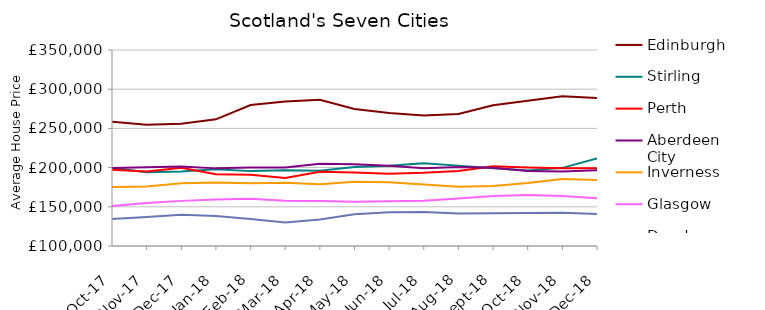
| Category | Edinburgh | Stirling | Perth | Aberdeen City | Inverness | Glasgow | Dundee |
|---|---|---|---|---|---|---|---|
| 2017-10-01 | 258624.658 | 199977.504 | 197366.042 | 199561.968 | 175219.552 | 150908.758 | 134506.967 |
| 2017-11-01 | 254723.349 | 193985.398 | 194982.195 | 200597.133 | 175912.734 | 154872.399 | 137051.835 |
| 2017-12-01 | 255812.34 | 194988.704 | 199764.477 | 201542.313 | 180030.372 | 157559.078 | 139823.634 |
| 2018-01-01 | 261527.705 | 197955.472 | 191472.703 | 199013.46 | 181027.908 | 159423.582 | 138331.855 |
| 2018-02-01 | 279795.792 | 195505.691 | 190803.982 | 200135.032 | 179984.645 | 160263.332 | 134403.409 |
| 2018-03-01 | 284301.797 | 196655.662 | 186883.475 | 200264.938 | 180783.251 | 157781.382 | 129941.658 |
| 2018-04-01 | 286435.635 | 196058.642 | 194690.449 | 204855.489 | 178649.291 | 157532.91 | 133847.643 |
| 2018-05-01 | 274766.971 | 200677.391 | 193680.482 | 204247.135 | 182000.185 | 156481.873 | 140390.241 |
| 2018-06-01 | 269594.657 | 202383.643 | 192214.267 | 202216.955 | 181179.906 | 157133.962 | 142984.789 |
| 2018-07-01 | 266337.836 | 205658.488 | 193390.083 | 199116.606 | 178451.222 | 157614.826 | 143220.398 |
| 2018-08-01 | 268434.838 | 202520.34 | 195810.133 | 200801.966 | 175634.015 | 160502.146 | 141457.627 |
| 2018-09-01 | 279504.125 | 199179.967 | 201632.597 | 199873.571 | 176394.968 | 163879.332 | 141726.442 |
| 2018-10-01 | 285212.94 | 196318.365 | 200160.657 | 195723.29 | 180339.231 | 164906.737 | 142065.833 |
| 2018-11-01 | 290977.759 | 199672.372 | 199233.136 | 195014.506 | 185445.086 | 163688.452 | 142438.644 |
| 2018-12-01 | 288756.022 | 211777.85 | 199011.499 | 196529.221 | 184169.747 | 160771.087 | 140661.319 |